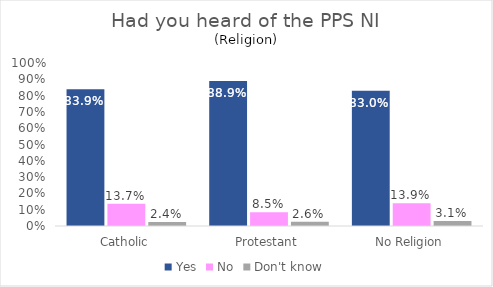
| Category | Yes | No | Don't know |
|---|---|---|---|
| Catholic | 0.839 | 0.137 | 0.024 |
| Protestant | 0.889 | 0.085 | 0.026 |
| No Religion | 0.83 | 0.139 | 0.031 |